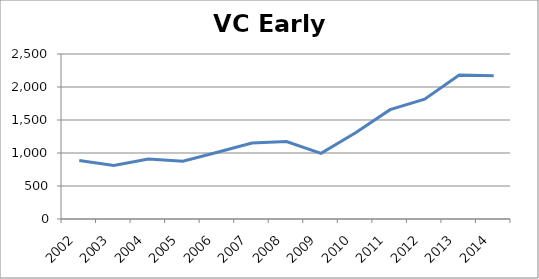
| Category | Number |
|---|---|
| 2002.0 | 886 |
| 2003.0 | 810 |
| 2004.0 | 908 |
| 2005.0 | 875 |
| 2006.0 | 1012 |
| 2007.0 | 1150 |
| 2008.0 | 1174 |
| 2009.0 | 995 |
| 2010.0 | 1306 |
| 2011.0 | 1657 |
| 2012.0 | 1815 |
| 2013.0 | 2181 |
| 2014.0 | 2170 |